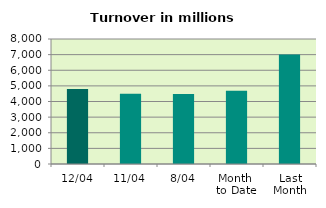
| Category | Series 0 |
|---|---|
| 12/04 | 4798.343 |
| 11/04 | 4498.91 |
| 8/04 | 4482.092 |
| Month 
to Date | 4690.436 |
| Last
Month | 7002.451 |